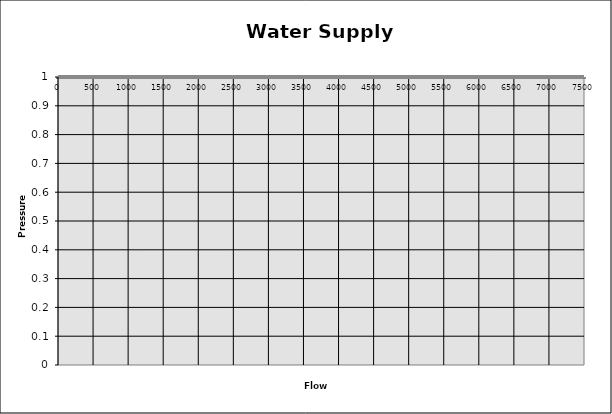
| Category | pressure |
|---|---|
| 0.0 | 0 |
| 500.0 | 0 |
| 1000.0 | 0 |
| 1500.0 | 0 |
| 2000.0 | 0 |
| 2500.0 | 0 |
| 3000.0 | 0 |
| 3500.0 | 0 |
| 4000.0 | 0 |
| 4500.0 | 0 |
| 5000.0 | 0 |
| 5500.0 | 0 |
| 6000.0 | 0 |
| 6500.0 | 0 |
| 7000.0 | 0 |
| 7500.0 | 0 |